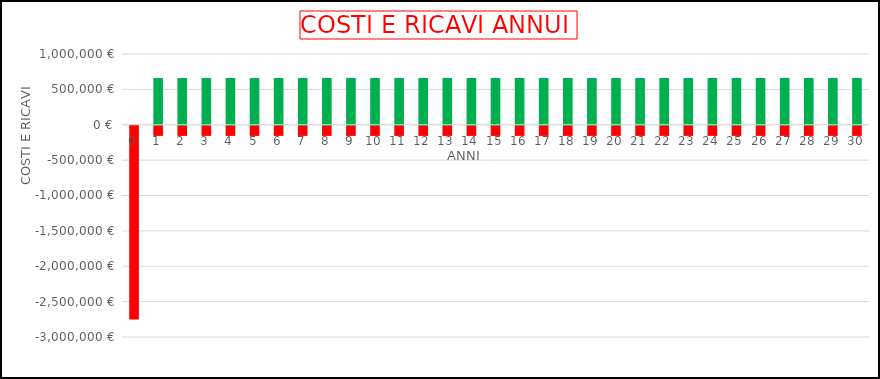
| Category | COSTI | RICAVI |
|---|---|---|
| 0.0 | -2738754.953 | 0 |
| 1.0 | -143683.88 | 660432.309 |
| 2.0 | -143683.88 | 660432.309 |
| 3.0 | -143683.88 | 660432.309 |
| 4.0 | -143683.88 | 660432.309 |
| 5.0 | -143683.88 | 660432.309 |
| 6.0 | -143683.88 | 660432.309 |
| 7.0 | -143683.88 | 660432.309 |
| 8.0 | -143683.88 | 660432.309 |
| 9.0 | -143683.88 | 660432.309 |
| 10.0 | -143683.88 | 660432.309 |
| 11.0 | -143683.88 | 660432.309 |
| 12.0 | -143683.88 | 660432.309 |
| 13.0 | -143683.88 | 660432.309 |
| 14.0 | -143683.88 | 660432.309 |
| 15.0 | -143683.88 | 660432.309 |
| 16.0 | -143683.88 | 660432.309 |
| 17.0 | -143683.88 | 660432.309 |
| 18.0 | -143683.88 | 660432.309 |
| 19.0 | -143683.88 | 660432.309 |
| 20.0 | -143683.88 | 660432.309 |
| 21.0 | -143683.88 | 660432.309 |
| 22.0 | -143683.88 | 660432.309 |
| 23.0 | -143683.88 | 660432.309 |
| 24.0 | -143683.88 | 660432.309 |
| 25.0 | -143683.88 | 660432.309 |
| 26.0 | -143683.88 | 660432.309 |
| 27.0 | -143683.88 | 660432.309 |
| 28.0 | -143683.88 | 660432.309 |
| 29.0 | -143683.88 | 660432.309 |
| 30.0 | -143683.88 | 660432.309 |